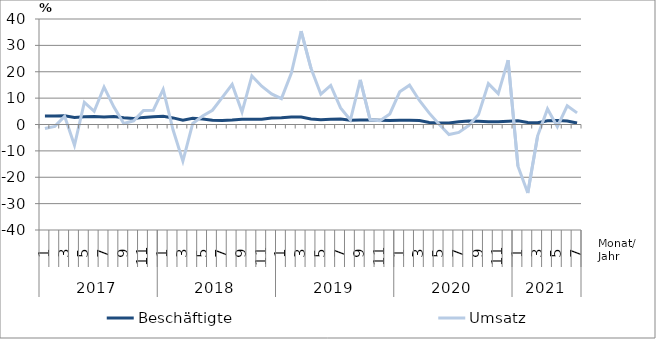
| Category | Beschäftigte | Umsatz |
|---|---|---|
| 0 | 3.2 | -1.5 |
| 1 | 3.2 | -0.7 |
| 2 | 3.3 | 3.1 |
| 3 | 2.7 | -7.9 |
| 4 | 2.9 | 8.4 |
| 5 | 3 | 5 |
| 6 | 2.8 | 14.2 |
| 7 | 3 | 6.6 |
| 8 | 2.6 | 0.4 |
| 9 | 2.3 | 1.4 |
| 10 | 2.7 | 5.3 |
| 11 | 2.9 | 5.4 |
| 12 | 3.1 | 13.3 |
| 13 | 2.5 | -2 |
| 14 | 1.6 | -13.9 |
| 15 | 2.4 | 0.4 |
| 16 | 2.1 | 3.2 |
| 17 | 1.6 | 5.4 |
| 18 | 1.5 | 10.3 |
| 19 | 1.7 | 15.2 |
| 20 | 2 | 4.7 |
| 21 | 2 | 18.4 |
| 22 | 2 | 14.5 |
| 23 | 2.5 | 11.6 |
| 24 | 2.6 | 9.8 |
| 25 | 2.8 | 19.4 |
| 26 | 2.8 | 35.4 |
| 27 | 2.1 | 21.3 |
| 28 | 1.8 | 11.5 |
| 29 | 2 | 14.8 |
| 30 | 2.1 | 6.3 |
| 31 | 1.6 | 1.7 |
| 32 | 1.7 | 16.9 |
| 33 | 1.7 | 1.8 |
| 34 | 1.6 | 1.4 |
| 35 | 1.5 | 4 |
| 36 | 1.6 | 12.4 |
| 37 | 1.6 | 14.9 |
| 38 | 1.5 | 9.1 |
| 39 | 0.8 | 4.3 |
| 40 | 0.6 | 0.1 |
| 41 | 0.6 | -3.8 |
| 42 | 1 | -3 |
| 43 | 1.3 | -0.4 |
| 44 | 1.2 | 3.8 |
| 45 | 1 | 15.5 |
| 46 | 1 | 11.7 |
| 47 | 1.2 | 24.4 |
| 48 | 1.4 | -15.8 |
| 49 | 0.8 | -26 |
| 50 | 0.7 | -4.3 |
| 51 | 1.4 | 5.9 |
| 52 | 1.5 | -0.8 |
| 53 | 1.3 | 7.1 |
| 54 | 0.6 | 4.4 |